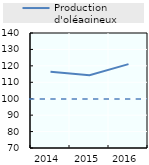
| Category | Production d'oléagineux |
|---|---|
| 2014.0 | 116.399 |
| 2015.0 | 114.358 |
| 2016.0 | 121.043 |